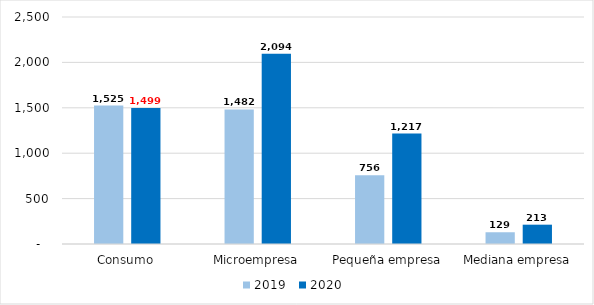
| Category | 2019 | 2020 |
|---|---|---|
| Consumo | 1525.228 | 1498.693 |
| Microempresa | 1481.946 | 2094.279 |
| Pequeña empresa | 756.055 | 1216.892 |
| Mediana empresa | 129.346 | 212.758 |